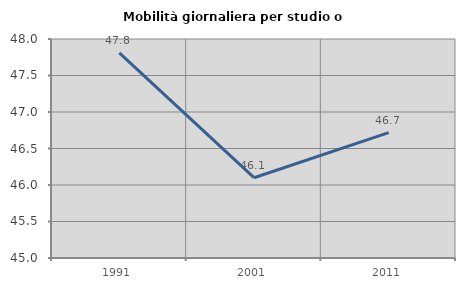
| Category | Mobilità giornaliera per studio o lavoro |
|---|---|
| 1991.0 | 47.811 |
| 2001.0 | 46.1 |
| 2011.0 | 46.717 |